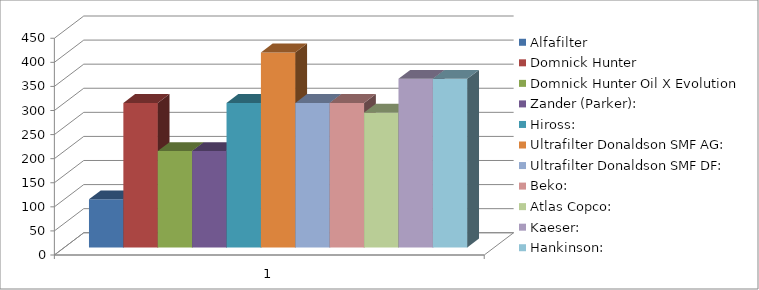
| Category | Alfafilter | Domnick Hunter | Domnick Hunter Oil X Evolution | Zander (Parker): | Hiross: | Ultrafilter Donaldson SMF AG: | Ultrafilter Donaldson SMF DF: | Beko: | Atlas Copco: | Kaeser: | Hankinson: |
|---|---|---|---|---|---|---|---|---|---|---|---|
| 0 | 100 | 300 | 200 | 200 | 300 | 405 | 300 | 300 | 280 | 350 | 350 |